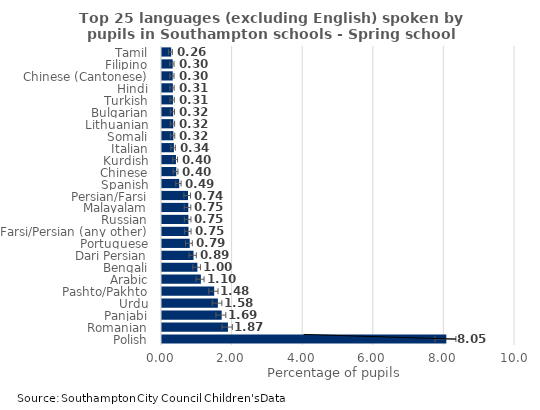
| Category | percent of each language |
|---|---|
| Polish | 8.055 |
| Romanian | 1.868 |
| Panjabi | 1.69 |
| Urdu | 1.583 |
| Pashto/Pakhto | 1.478 |
| Arabic | 1.101 |
| Bengali | 1.003 |
| Dari Persian | 0.893 |
| Portuguese | 0.785 |
| Farsi/Persian (any other) | 0.751 |
| Russian | 0.748 |
| Malayalam | 0.745 |
| Persian/Farsi | 0.736 |
| Spanish | 0.488 |
| Chinese | 0.405 |
| Kurdish | 0.396 |
| Italian | 0.337 |
| Somali | 0.322 |
| Lithuanian | 0.319 |
| Bulgarian | 0.316 |
| Turkish | 0.31 |
| Hindi | 0.307 |
| Chinese (Cantonese) | 0.304 |
| Filipino | 0.304 |
| Tamil | 0.261 |